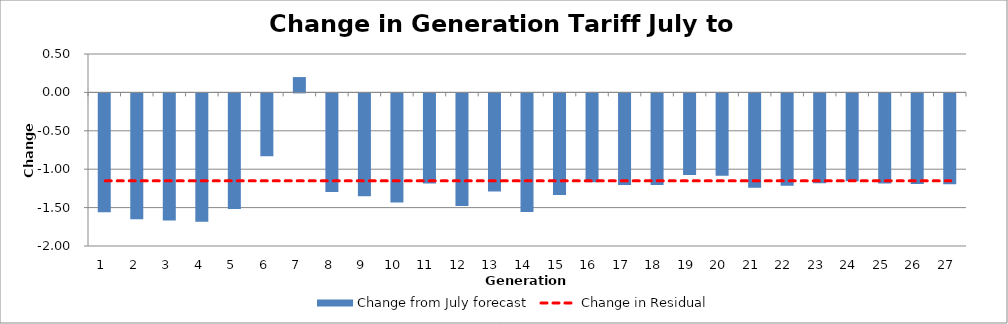
| Category | Change from July forecast |
|---|---|
| 1.0 | -1.547 |
| 2.0 | -1.638 |
| 3.0 | -1.656 |
| 4.0 | -1.67 |
| 5.0 | -1.504 |
| 6.0 | -0.819 |
| 7.0 | 0.2 |
| 8.0 | -1.283 |
| 9.0 | -1.339 |
| 10.0 | -1.42 |
| 11.0 | -1.174 |
| 12.0 | -1.467 |
| 13.0 | -1.276 |
| 14.0 | -1.545 |
| 15.0 | -1.321 |
| 16.0 | -1.158 |
| 17.0 | -1.194 |
| 18.0 | -1.193 |
| 19.0 | -1.062 |
| 20.0 | -1.073 |
| 21.0 | -1.228 |
| 22.0 | -1.203 |
| 23.0 | -1.17 |
| 24.0 | -1.145 |
| 25.0 | -1.172 |
| 26.0 | -1.179 |
| 27.0 | -1.182 |